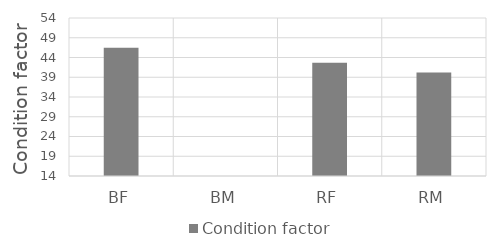
| Category | Condition factor |
|---|---|
| BF | 46.451 |
| BM | 0 |
| RF | 42.644 |
| RM | 40.233 |